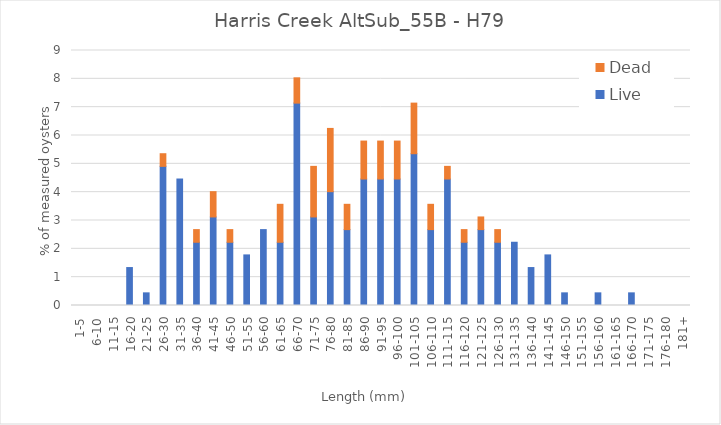
| Category | Live | Dead |
|---|---|---|
| 1-5 | 0 | 0 |
| 6-10 | 0 | 0 |
| 11-15 | 0 | 0 |
| 16-20 | 1.339 | 0 |
| 21-25 | 0.446 | 0 |
| 26-30 | 4.911 | 0.446 |
| 31-35 | 4.464 | 0 |
| 36-40 | 2.232 | 0.446 |
| 41-45 | 3.125 | 0.893 |
| 46-50 | 2.232 | 0.446 |
| 51-55 | 1.786 | 0 |
| 56-60 | 2.679 | 0 |
| 61-65 | 2.232 | 1.339 |
| 66-70 | 7.143 | 0.893 |
| 71-75 | 3.125 | 1.786 |
| 76-80 | 4.018 | 2.232 |
| 81-85 | 2.679 | 0.893 |
| 86-90 | 4.464 | 1.339 |
| 91-95 | 4.464 | 1.339 |
| 96-100 | 4.464 | 1.339 |
| 101-105 | 5.357 | 1.786 |
| 106-110 | 2.679 | 0.893 |
| 111-115 | 4.464 | 0.446 |
| 116-120 | 2.232 | 0.446 |
| 121-125 | 2.679 | 0.446 |
| 126-130 | 2.232 | 0.446 |
| 131-135 | 2.232 | 0 |
| 136-140 | 1.339 | 0 |
| 141-145 | 1.786 | 0 |
| 146-150 | 0.446 | 0 |
| 151-155 | 0 | 0 |
| 156-160 | 0.446 | 0 |
| 161-165 | 0 | 0 |
| 166-170 | 0.446 | 0 |
| 171-175 | 0 | 0 |
| 176-180 | 0 | 0 |
| 181+ | 0 | 0 |